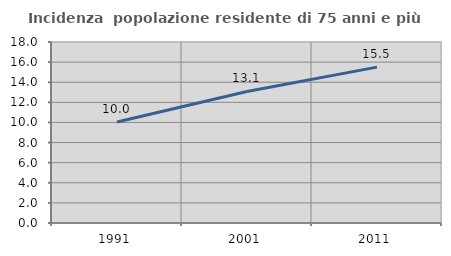
| Category | Incidenza  popolazione residente di 75 anni e più |
|---|---|
| 1991.0 | 10.039 |
| 2001.0 | 13.078 |
| 2011.0 | 15.5 |